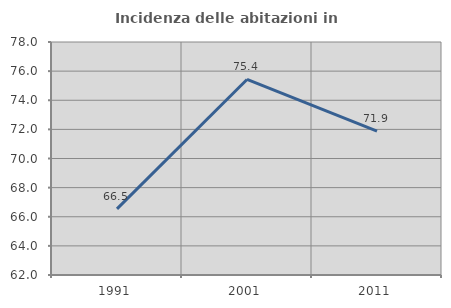
| Category | Incidenza delle abitazioni in proprietà  |
|---|---|
| 1991.0 | 66.544 |
| 2001.0 | 75.427 |
| 2011.0 | 71.875 |